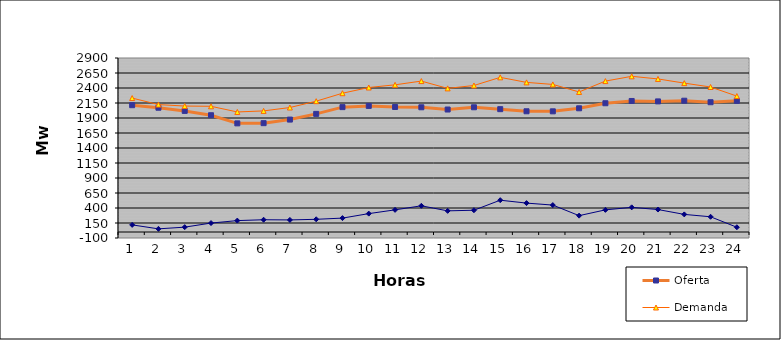
| Category | Oferta | Demanda | No Servida |
|---|---|---|---|
| 1.0 | 2113.44 | 2232.068 | 118.628 |
| 2.0 | 2071.2 | 2123.62 | 52.42 |
| 3.0 | 2018.25 | 2099.177 | 80.927 |
| 4.0 | 1946.15 | 2094.995 | 148.845 |
| 5.0 | 1810.54 | 2000.635 | 190.095 |
| 6.0 | 1813.95 | 2018.344 | 204.394 |
| 7.0 | 1873.61 | 2074.705 | 201.095 |
| 8.0 | 1968.69 | 2180.368 | 211.678 |
| 9.0 | 2081.07 | 2312.814 | 231.744 |
| 10.0 | 2101.7 | 2408.182 | 306.482 |
| 11.0 | 2083.74 | 2452.951 | 369.211 |
| 12.0 | 2078.47 | 2515.106 | 436.636 |
| 13.0 | 2041.2 | 2393.575 | 352.375 |
| 14.0 | 2078.77 | 2441.756 | 362.986 |
| 15.0 | 2047.18 | 2577.372 | 530.192 |
| 16.0 | 2012.06 | 2493.653 | 481.593 |
| 17.0 | 2011.15 | 2459.633 | 448.483 |
| 18.0 | 2061.79 | 2334.375 | 272.585 |
| 19.0 | 2146.02 | 2514.92 | 368.9 |
| 20.0 | 2183.62 | 2594.567 | 410.947 |
| 21.0 | 2176.75 | 2551.146 | 374.396 |
| 22.0 | 2188.21 | 2481.448 | 293.238 |
| 23.0 | 2162.91 | 2416.557 | 253.647 |
| 24.0 | 2185.91 | 2265.1 | 79.19 |